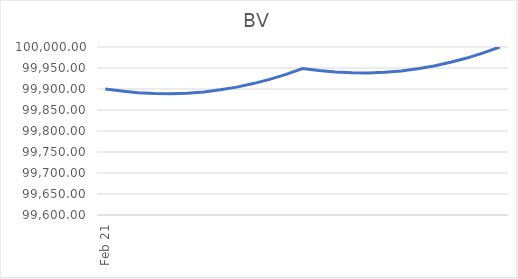
| Category | BV |
|---|---|
| 2021-02-01 | 99900.001 |
| 2021-03-01 | 99894.99 |
| 2021-04-01 | 99891.11 |
| 2021-05-01 | 99889.04 |
| 2021-06-01 | 99888.64 |
| 2021-07-01 | 99889.96 |
| 2021-08-01 | 99893.08 |
| 2021-09-01 | 99897.99 |
| 2021-10-01 | 99904.45 |
| 2021-11-01 | 99912.91 |
| 2021-12-01 | 99922.84 |
| 2022-01-01 | 99934.89 |
| 2022-02-01 | 99948.77 |
| 2022-03-01 | 99943.94 |
| 2022-04-01 | 99940.27 |
| 2022-05-01 | 99938.4 |
| 2022-06-01 | 99938.21 |
| 2022-07-01 | 99939.73 |
| 2022-08-01 | 99943.05 |
| 2022-09-01 | 99948.17 |
| 2022-10-01 | 99954.84 |
| 2022-11-01 | 99963.51 |
| 2022-12-01 | 99973.65 |
| 2023-01-01 | 99985.91 |
| 2023-02-01 | 100000 |